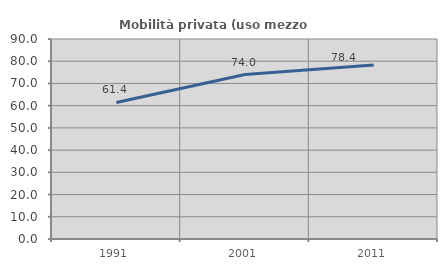
| Category | Mobilità privata (uso mezzo privato) |
|---|---|
| 1991.0 | 61.427 |
| 2001.0 | 74.007 |
| 2011.0 | 78.351 |